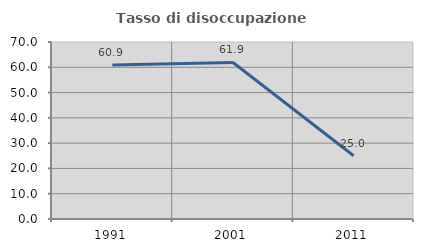
| Category | Tasso di disoccupazione giovanile  |
|---|---|
| 1991.0 | 60.87 |
| 2001.0 | 61.905 |
| 2011.0 | 25 |